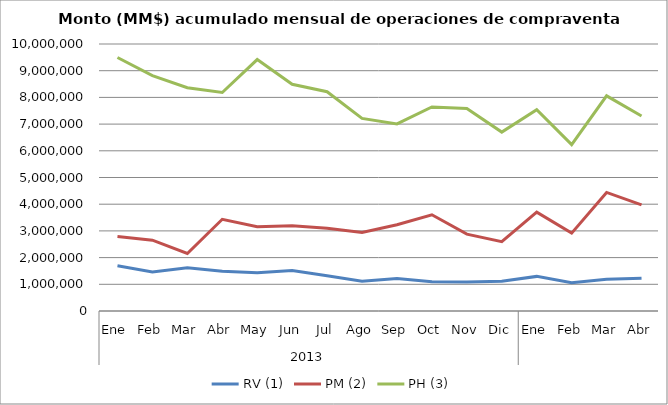
| Category | RV (1) | PM (2) | PH (3) |
|---|---|---|---|
| 0 | 1693090.019 | 2788692.01 | 9495719.157 |
| 1 | 1457870.523 | 2652319.476 | 8814454.346 |
| 2 | 1619570.46 | 2155113.626 | 8361658.957 |
| 3 | 1485677.791 | 3434435.881 | 8182321.991 |
| 4 | 1434943.507 | 3155786.06 | 9417818.094 |
| 5 | 1516566.545 | 3191285.457 | 8490151.421 |
| 6 | 1322115.523 | 3099755.507 | 8212010.547 |
| 7 | 1118245.895 | 2937089.197 | 7211658.784 |
| 8 | 1215047.725 | 3232334.418 | 7008526.172 |
| 9 | 1092035.083 | 3603082.09 | 7640993.748 |
| 10 | 1088055.605 | 2879188.198 | 7583918.365 |
| 11 | 1114851.326 | 2596986.123 | 6700659.979 |
| 12 | 1296256.43 | 3700290.091 | 7538361.261 |
| 13 | 1061199.219 | 2915830.381 | 6230064.605 |
| 14 | 1189463.212 | 4440910.02 | 8058380.739 |
| 15 | 1231035.305 | 3977428.452 | 7305106.144 |